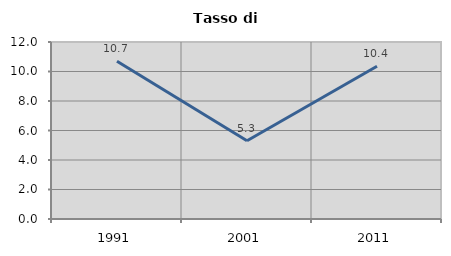
| Category | Tasso di disoccupazione   |
|---|---|
| 1991.0 | 10.694 |
| 2001.0 | 5.308 |
| 2011.0 | 10.356 |